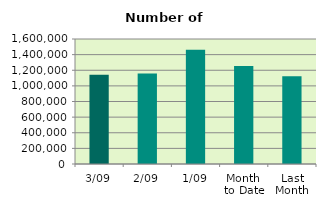
| Category | Series 0 |
|---|---|
| 3/09 | 1142740 |
| 2/09 | 1158544 |
| 1/09 | 1461322 |
| Month 
to Date | 1254202 |
| Last
Month | 1124493.364 |